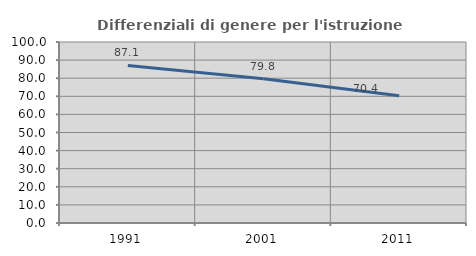
| Category | Differenziali di genere per l'istruzione superiore |
|---|---|
| 1991.0 | 87.051 |
| 2001.0 | 79.758 |
| 2011.0 | 70.359 |